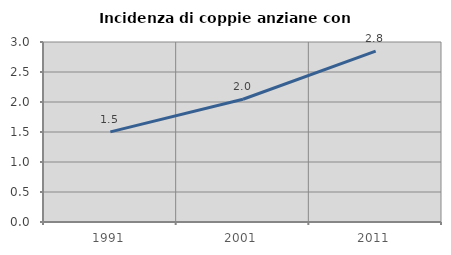
| Category | Incidenza di coppie anziane con figli |
|---|---|
| 1991.0 | 1.502 |
| 2001.0 | 2.046 |
| 2011.0 | 2.847 |